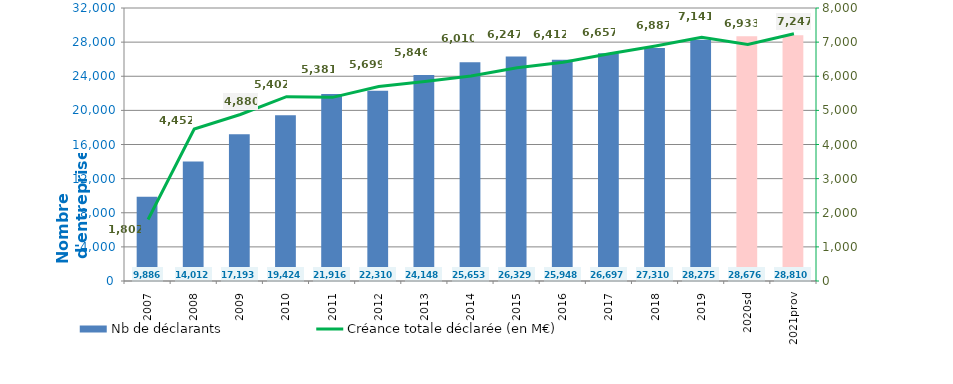
| Category | Nb de déclarants |
|---|---|
| 2007 | 9886 |
| 2008 | 14012 |
| 2009 | 17193 |
| 2010 | 19424 |
| 2011 | 21916 |
| 2012 | 22310 |
| 2013 | 24148 |
| 2014 | 25653 |
| 2015 | 26329 |
| 2016 | 25948 |
| 2017 | 26697 |
| 2018 | 27310 |
| 2019 | 28275 |
| 2020sd | 28676 |
| 2021prov | 28810 |